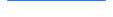
| Category | Series 0 |
|---|---|
| 0 | 147 |
| 1 | 141 |
| 2 | 164 |
| 3 | 147 |
| 4 | 159 |
| 5 | 149 |
| 6 | 162 |
| 7 | 173 |
| 8 | 175 |